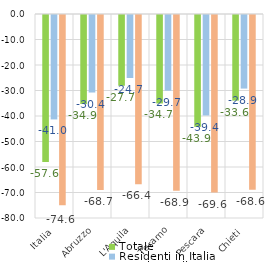
| Category | Totale | Residenti in Italia | Residenti all'estero |
|---|---|---|---|
| Italia | -57.603 | -40.953 | -74.601 |
| Abruzzo | -34.89 | -30.402 | -68.671 |
| L'Aquila | -27.741 | -24.704 | -66.353 |
| Teramo | -34.699 | -29.681 | -68.943 |
| Pescara | -43.879 | -39.413 | -69.61 |
| Chieti | -33.57 | -28.854 | -68.568 |